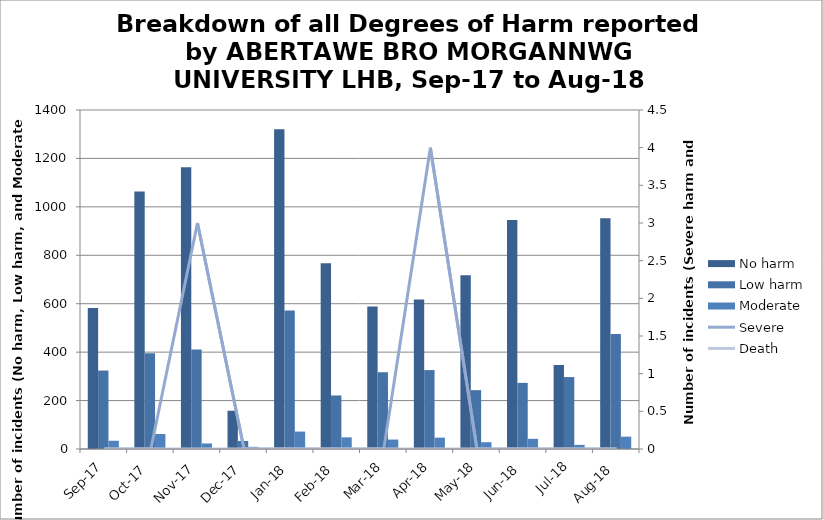
| Category | No harm | Low harm | Moderate |
|---|---|---|---|
| Sep-17 | 582 | 324 | 34 |
| Oct-17 | 1063 | 395 | 62 |
| Nov-17 | 1164 | 411 | 23 |
| Dec-17 | 158 | 33 | 9 |
| Jan-18 | 1321 | 572 | 72 |
| Feb-18 | 767 | 221 | 48 |
| Mar-18 | 589 | 317 | 39 |
| Apr-18 | 617 | 326 | 47 |
| May-18 | 718 | 243 | 28 |
| Jun-18 | 946 | 273 | 42 |
| Jul-18 | 347 | 297 | 17 |
| Aug-18 | 953 | 475 | 51 |